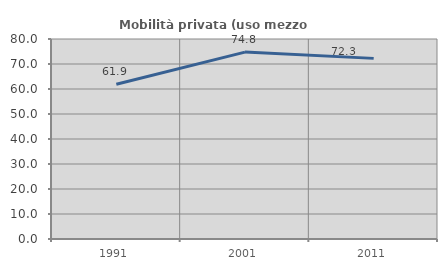
| Category | Mobilità privata (uso mezzo privato) |
|---|---|
| 1991.0 | 61.931 |
| 2001.0 | 74.759 |
| 2011.0 | 72.25 |